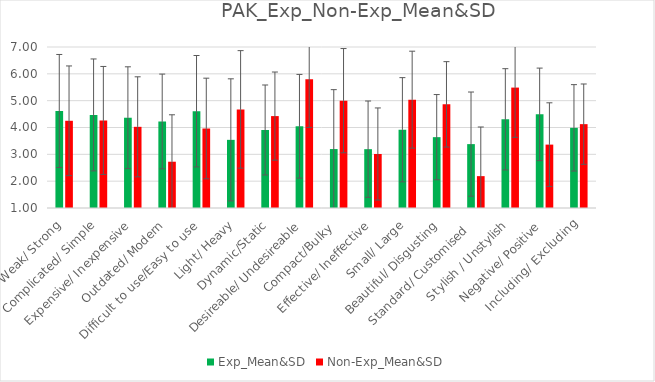
| Category | Exp_Mean&SD | Non-Exp_Mean&SD |
|---|---|---|
| Weak/ Strong | 4.615 | 4.25 |
| Complicated/ Simple | 4.469 | 4.262 |
| Expensive/ Inexpensive | 4.364 | 4.025 |
| Outdated/ Modern | 4.226 | 2.725 |
| Difficult to use/Easy to use | 4.607 | 3.962 |
| Light/ Heavy | 3.54 | 4.675 |
| Dynamic/Static | 3.908 | 4.425 |
| Desireable/ Undesireable | 4.046 | 5.8 |
| Compact/Bulky  | 3.197 | 5 |
| Effective/ Ineffective | 3.192 | 3.012 |
| Small/ Large | 3.916 | 5.038 |
| Beautiful/ Disgusting | 3.64 | 4.862 |
| Standard/ Customised   | 3.381 | 2.188 |
| Stylish / Unstylish | 4.305 | 5.488 |
| Negative/ Positive | 4.49 | 3.362 |
| Including/ Excluding | 3.987 | 4.125 |